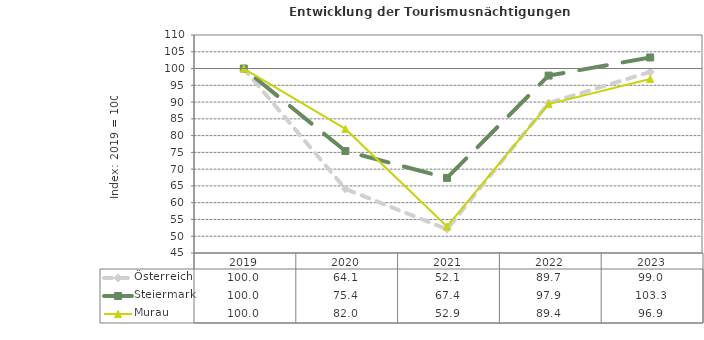
| Category | Österreich | Steiermark | Murau |
|---|---|---|---|
| 2023.0 | 99 | 103.3 | 96.9 |
| 2022.0 | 89.7 | 97.9 | 89.4 |
| 2021.0 | 52.1 | 67.4 | 52.9 |
| 2020.0 | 64.1 | 75.4 | 82 |
| 2019.0 | 100 | 100 | 100 |